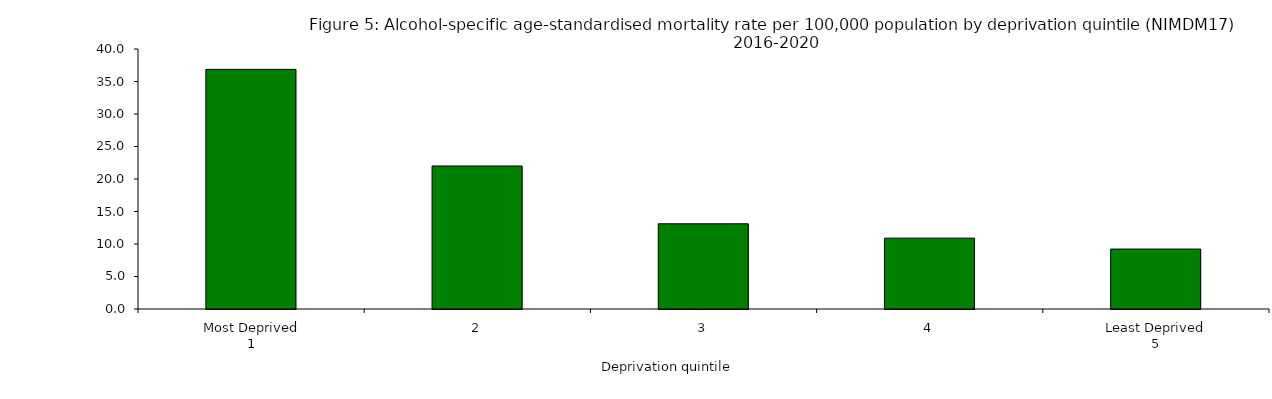
| Category | Series 0 |
|---|---|
| Most Deprived
1 | 36.863 |
| 2 | 22 |
| 3 | 13.107 |
| 4 | 10.9 |
| Least Deprived
5 | 9.22 |